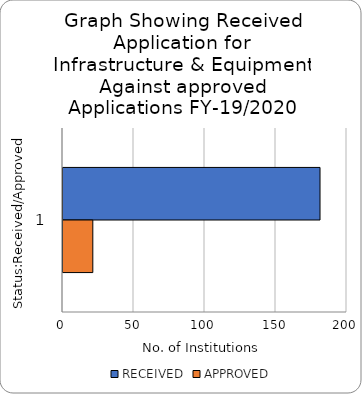
| Category | RECEIVED  | APPROVED |
|---|---|---|
| 0 | 181 | 21 |